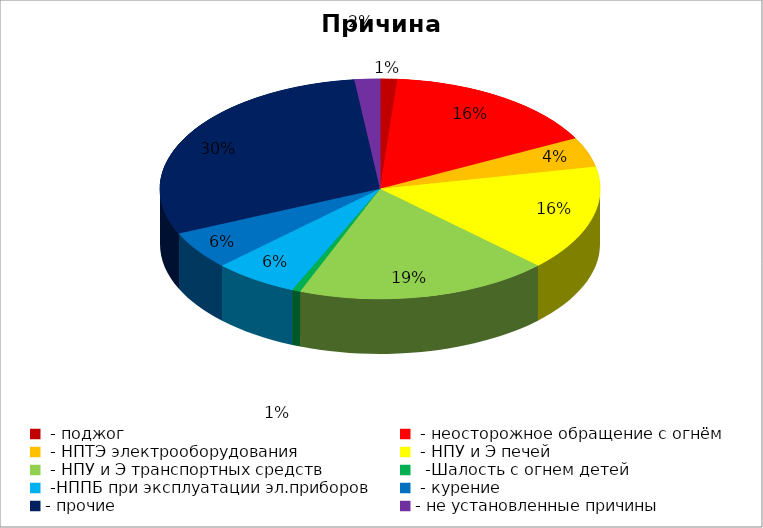
| Category | Причина пожара |
|---|---|
|  - поджог | 2 |
|  - неосторожное обращение с огнём | 26 |
|  - НПТЭ электрооборудования | 7 |
|  - НПУ и Э печей | 25 |
|  - НПУ и Э транспортных средств | 30 |
|   -Шалость с огнем детей | 1 |
|  -НППБ при эксплуатации эл.приборов | 10 |
|  - курение | 9 |
| - прочие | 48 |
| - не установленные причины | 3 |